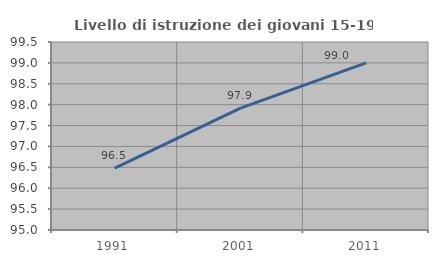
| Category | Livello di istruzione dei giovani 15-19 anni |
|---|---|
| 1991.0 | 96.479 |
| 2001.0 | 97.917 |
| 2011.0 | 99.002 |